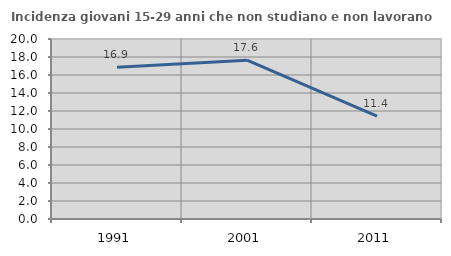
| Category | Incidenza giovani 15-29 anni che non studiano e non lavorano  |
|---|---|
| 1991.0 | 16.857 |
| 2001.0 | 17.647 |
| 2011.0 | 11.429 |